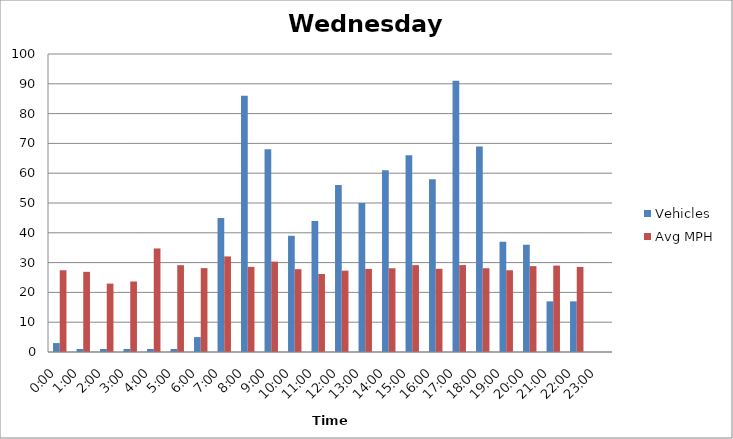
| Category | Vehicles | Avg MPH |
|---|---|---|
| 0:00 | 3 | 27.43 |
| 1:00 | 1 | 26.9 |
| 2:00 | 1 | 22.95 |
| 3:00 | 1 | 23.66 |
| 4:00 | 1 | 34.75 |
| 5:00 | 1 | 29.13 |
| 6:00 | 5 | 28.15 |
| 7:00 | 45 | 32.07 |
| 8:00 | 86 | 28.57 |
| 9:00 | 68 | 30.32 |
| 10:00 | 39 | 27.8 |
| 11:00 | 44 | 26.18 |
| 12:00 | 56 | 27.29 |
| 13:00 | 50 | 27.88 |
| 14:00 | 61 | 28.1 |
| 15:00 | 66 | 29.15 |
| 16:00 | 58 | 27.92 |
| 17:00 | 91 | 29.16 |
| 18:00 | 69 | 28.11 |
| 19:00 | 37 | 27.43 |
| 20:00 | 36 | 28.82 |
| 21:00 | 17 | 29 |
| 22:00 | 17 | 28.54 |
| 23:00 | 0 | 0 |